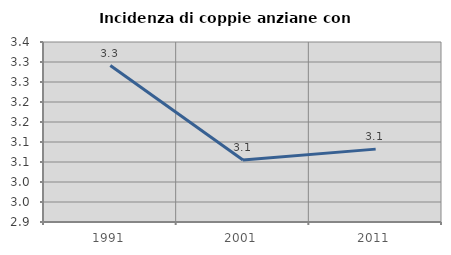
| Category | Incidenza di coppie anziane con figli |
|---|---|
| 1991.0 | 3.291 |
| 2001.0 | 3.055 |
| 2011.0 | 3.082 |